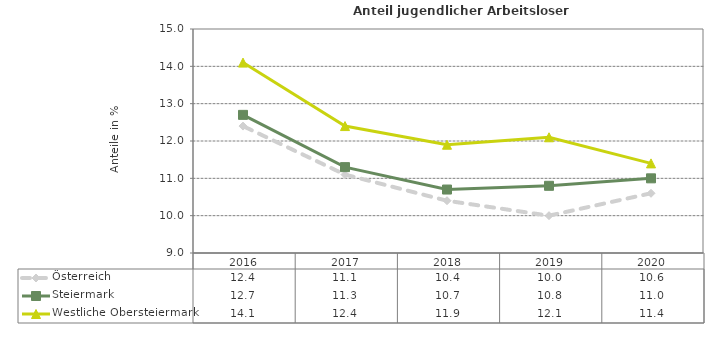
| Category | Österreich | Steiermark | Westliche Obersteiermark |
|---|---|---|---|
| 2020.0 | 10.6 | 11 | 11.4 |
| 2019.0 | 10 | 10.8 | 12.1 |
| 2018.0 | 10.4 | 10.7 | 11.9 |
| 2017.0 | 11.1 | 11.3 | 12.4 |
| 2016.0 | 12.4 | 12.7 | 14.1 |